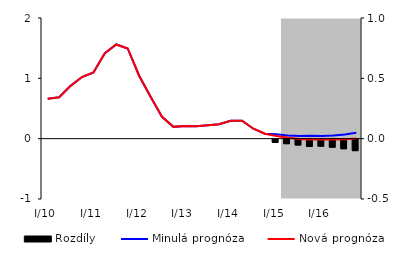
| Category | Rozdíly |
|---|---|
| 0 | 0 |
| 1 | 0 |
| 2 | 0 |
| 3 | 0 |
| 4 | 0 |
| 5 | 0 |
| 6 | 0 |
| 7 | 0 |
| 8 | 0 |
| 9 | 0 |
| 10 | 0 |
| 11 | 0 |
| 12 | 0 |
| 13 | 0 |
| 14 | 0 |
| 15 | 0 |
| 16 | 0 |
| 17 | 0 |
| 18 | 0 |
| 19 | 0 |
| 20 | -0.026 |
| 21 | -0.037 |
| 22 | -0.048 |
| 23 | -0.06 |
| 24 | -0.058 |
| 25 | -0.066 |
| 26 | -0.079 |
| 27 | -0.095 |